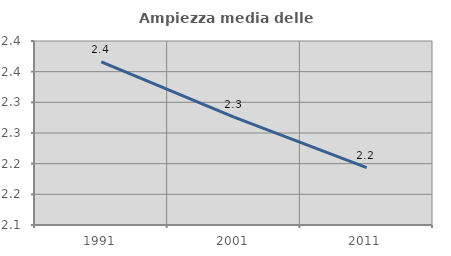
| Category | Ampiezza media delle famiglie |
|---|---|
| 1991.0 | 2.366 |
| 2001.0 | 2.276 |
| 2011.0 | 2.194 |